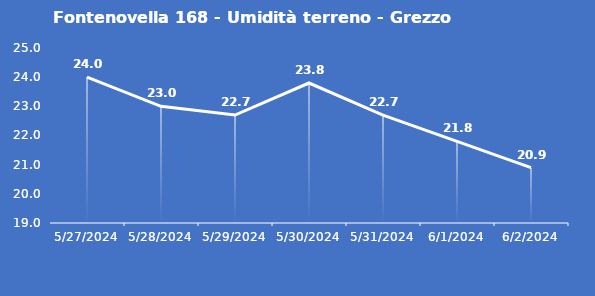
| Category | Fontenovella 168 - Umidità terreno - Grezzo (%VWC) |
|---|---|
| 5/27/24 | 24 |
| 5/28/24 | 23 |
| 5/29/24 | 22.7 |
| 5/30/24 | 23.8 |
| 5/31/24 | 22.7 |
| 6/1/24 | 21.8 |
| 6/2/24 | 20.9 |